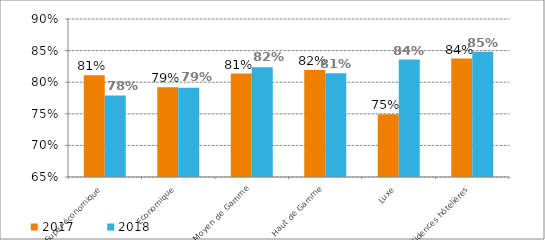
| Category | 2017 | 2018 |
|---|---|---|
| Super-économique | 0.811 | 0.779 |
| Economique | 0.792 | 0.791 |
| Moyen de Gamme | 0.814 | 0.824 |
| Haut de Gamme | 0.819 | 0.814 |
| Luxe | 0.749 | 0.836 |
| Résidences hôtelières | 0.837 | 0.848 |